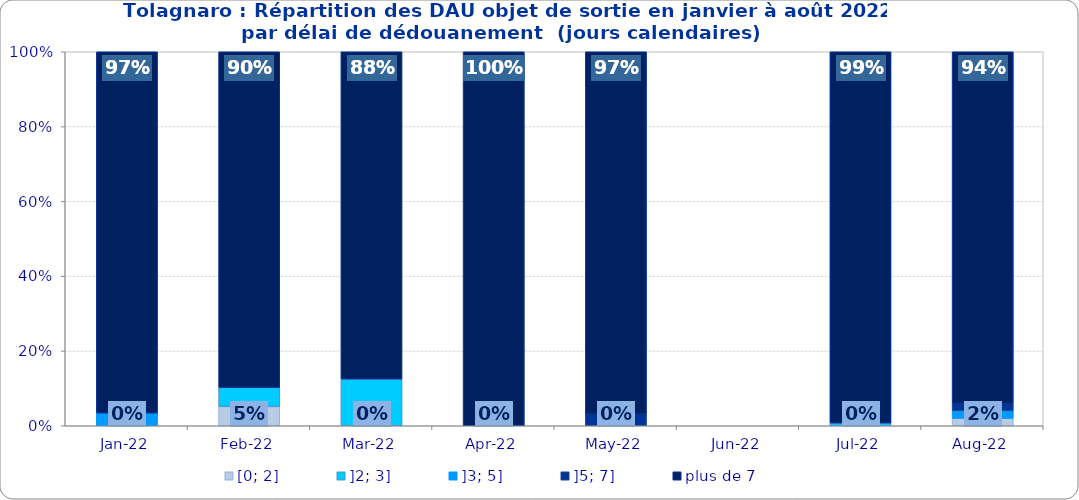
| Category | [0; 2] | ]2; 3] | ]3; 5] | ]5; 7] | plus de 7 |
|---|---|---|---|---|---|
| 2022-01-01 | 0 | 0 | 0.034 | 0 | 0.966 |
| 2022-02-01 | 0.051 | 0.051 | 0 | 0 | 0.897 |
| 2022-03-01 | 0 | 0.125 | 0 | 0 | 0.875 |
| 2022-04-01 | 0 | 0 | 0 | 0 | 1 |
| 2022-05-01 | 0 | 0 | 0 | 0.031 | 0.969 |
| 2022-06-01 | 0 | 0 | 0 | 0 | 0 |
| 2022-07-01 | 0 | 0.007 | 0 | 0 | 0.993 |
| 2022-08-01 | 0.02 | 0 | 0.02 | 0.02 | 0.94 |